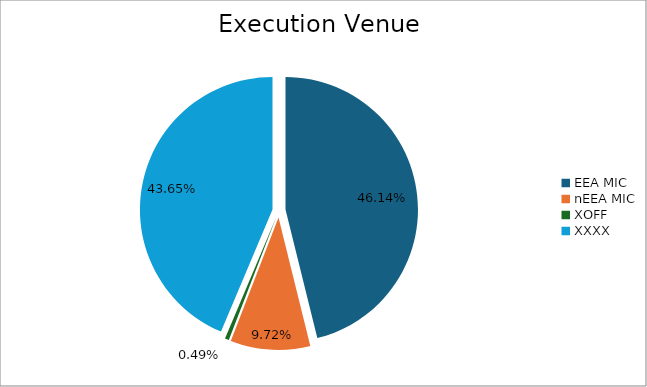
| Category | Series 0 |
|---|---|
| EEA MIC | 5563468.142 |
| nEEA MIC | 1172099.915 |
| XOFF | 59142.88 |
| XXXX | 5262925.262 |